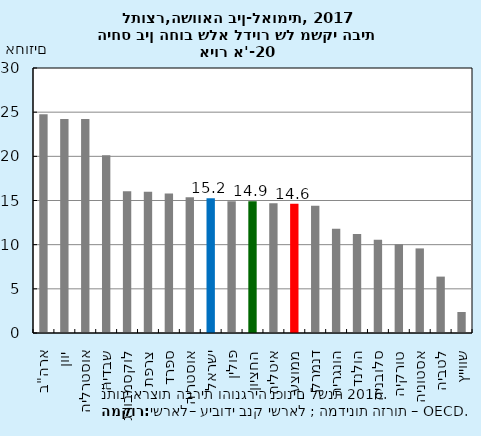
| Category | Series 0 |
|---|---|
| ארה"ב | 24.751 |
| יוון | 24.22 |
| אוסטרליה | 24.218 |
| שבדיה | 20.111 |
| לוקסמבורג | 16.042 |
| צרפת | 16.002 |
| ספרד | 15.806 |
| אוסטריה | 15.38 |
| ישראל | 15.25 |
| פולין | 14.913 |
| החציון | 14.913 |
| איטליה | 14.687 |
| ממוצע | 14.619 |
| דנמרק | 14.416 |
| הונגריה | 11.814 |
| הולנד | 11.203 |
| סלובניה | 10.561 |
| טורקיה | 10.046 |
| אסטוניה | 9.576 |
| לטביה | 6.384 |
| שווייץ | 2.378 |